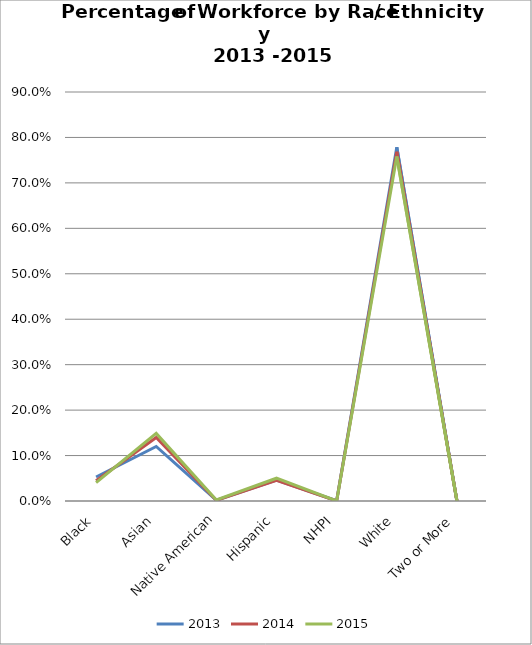
| Category | 2013 | 2014 | 2015 |
|---|---|---|---|
| Black | 0.053 | 0.044 | 0.041 |
| Asian | 0.12 | 0.14 | 0.149 |
| Native American | 0.002 | 0.002 | 0.002 |
| Hispanic | 0.046 | 0.045 | 0.05 |
| NHPI | 0.001 | 0 | 0 |
| White | 0.779 | 0.769 | 0.758 |
| Two or More | 0 | 0 | 0 |